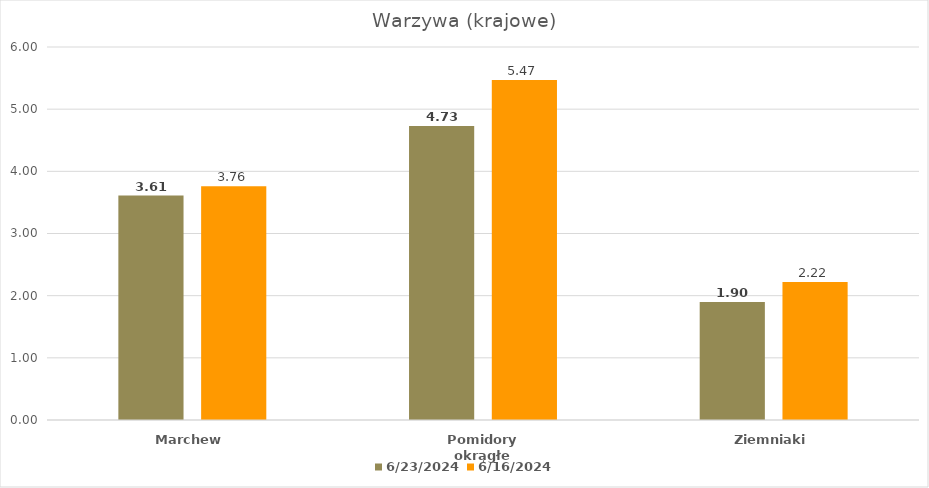
| Category | 2024-06-23 | 2024-06-16 |
|---|---|---|
| Marchew | 3.61 | 3.76 |
| Pomidory okrągłe | 4.73 | 5.47 |
| Ziemniaki | 1.9 | 2.22 |